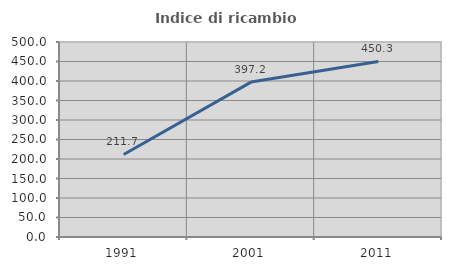
| Category | Indice di ricambio occupazionale  |
|---|---|
| 1991.0 | 211.698 |
| 2001.0 | 397.175 |
| 2011.0 | 450.254 |